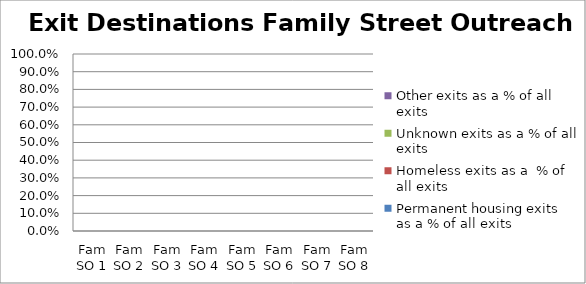
| Category | Permanent housing exits as a % of all exits | Homeless exits as a  % of all exits | Unknown exits as a % of all exits | Other exits as a % of all exits |
|---|---|---|---|---|
| Fam SO 1 | 0 | 0 | 0 | 0 |
| Fam SO 2 | 0 | 0 | 0 | 0 |
| Fam SO 3 | 0 | 0 | 0 | 0 |
| Fam SO 4 | 0 | 0 | 0 | 0 |
| Fam SO 5 | 0 | 0 | 0 | 0 |
| Fam SO 6 | 0 | 0 | 0 | 0 |
| Fam SO 7 | 0 | 0 | 0 | 0 |
| Fam SO 8 | 0 | 0 | 0 | 0 |